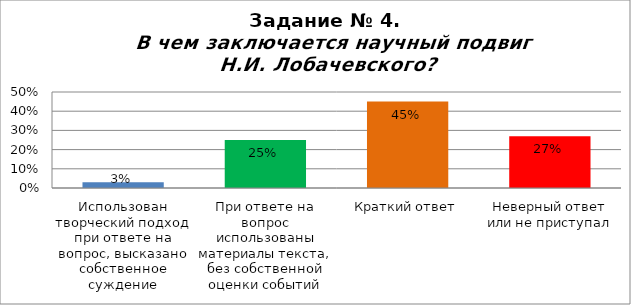
| Category | В чем заключается научный подвиг Н.И. Лобачевского? |
|---|---|
| Использован творческий подход при ответе на вопрос, высказано собственное суждение | 0.03 |
| При ответе на вопрос использованы материалы текста, без собственной оценки событий | 0.25 |
| Краткий ответ | 0.45 |
| Неверный ответ или не приступал | 0.27 |